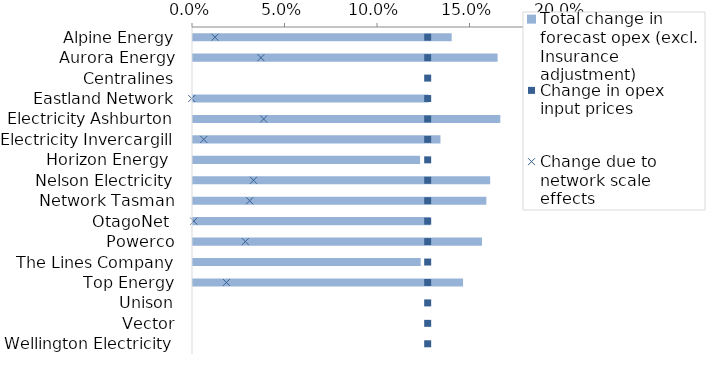
| Category | Total change in forecast opex (excl. Insurance adjustment) |
|---|---|
| Alpine Energy | 0.14 |
| Aurora Energy | 0.165 |
| Centralines | 0 |
| Eastland Network | 0.127 |
| Electricity Ashburton | 0.166 |
| Electricity Invercargill | 0.134 |
| Horizon Energy  | 0.123 |
| Nelson Electricity | 0.161 |
| Network Tasman | 0.159 |
| OtagoNet  | 0.128 |
| Powerco | 0.156 |
| The Lines Company | 0.123 |
| Top Energy | 0.146 |
| Unison | 0 |
| Vector | 0 |
| Wellington Electricity | 0 |